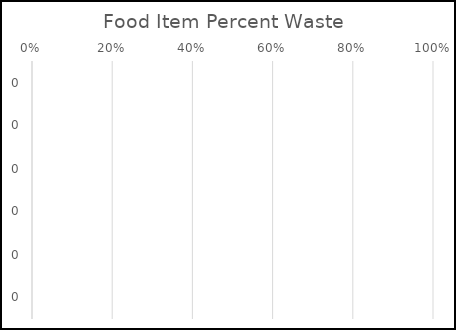
| Category | Series 0 |
|---|---|
| 0.0 | 0 |
| 0.0 | 0 |
| 0.0 | 0 |
| 0.0 | 0 |
| 0.0 | 0 |
| 0.0 | 0 |